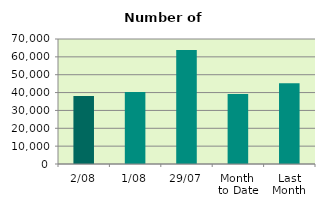
| Category | Series 0 |
|---|---|
| 2/08 | 38138 |
| 1/08 | 40362 |
| 29/07 | 63890 |
| Month 
to Date | 39250 |
| Last
Month | 45220.286 |